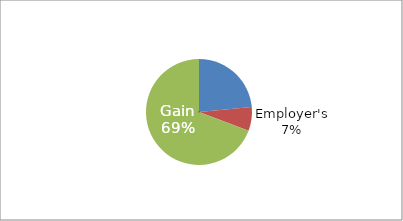
| Category | Series 0 |
|---|---|
| Your | 1179010.595 |
| Employer's | 362772.491 |
| Gain | 3470700.296 |